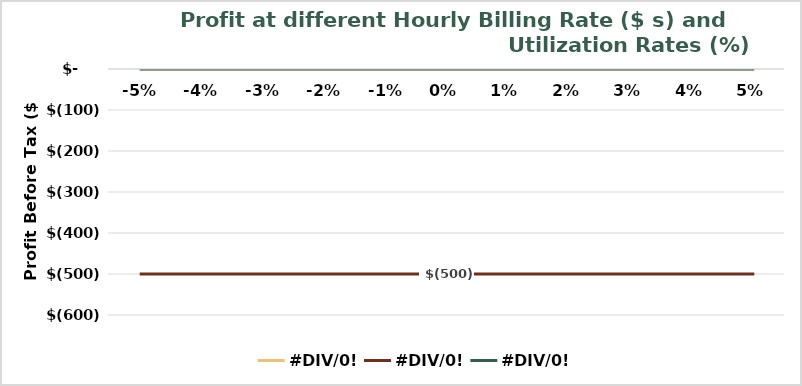
| Category |  #DIV/0!  |
|---|---|
| -0.05 | 0 |
| -0.04 | 0 |
| -0.03 | 0 |
| -0.02 | 0 |
| -0.01 | 0 |
| 0.0 | 0 |
| 0.01 | 0 |
| 0.02 | 0 |
| 0.03 | 0 |
| 0.04 | 0 |
| 0.05 | 0 |